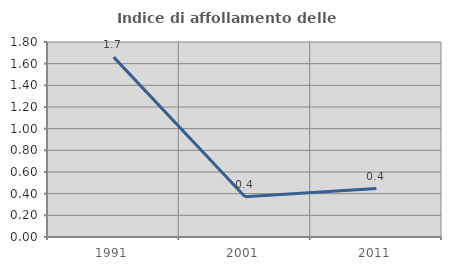
| Category | Indice di affollamento delle abitazioni  |
|---|---|
| 1991.0 | 1.66 |
| 2001.0 | 0.371 |
| 2011.0 | 0.447 |